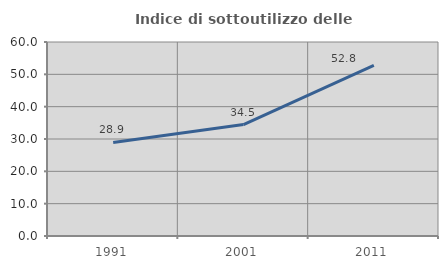
| Category | Indice di sottoutilizzo delle abitazioni  |
|---|---|
| 1991.0 | 28.944 |
| 2001.0 | 34.45 |
| 2011.0 | 52.786 |